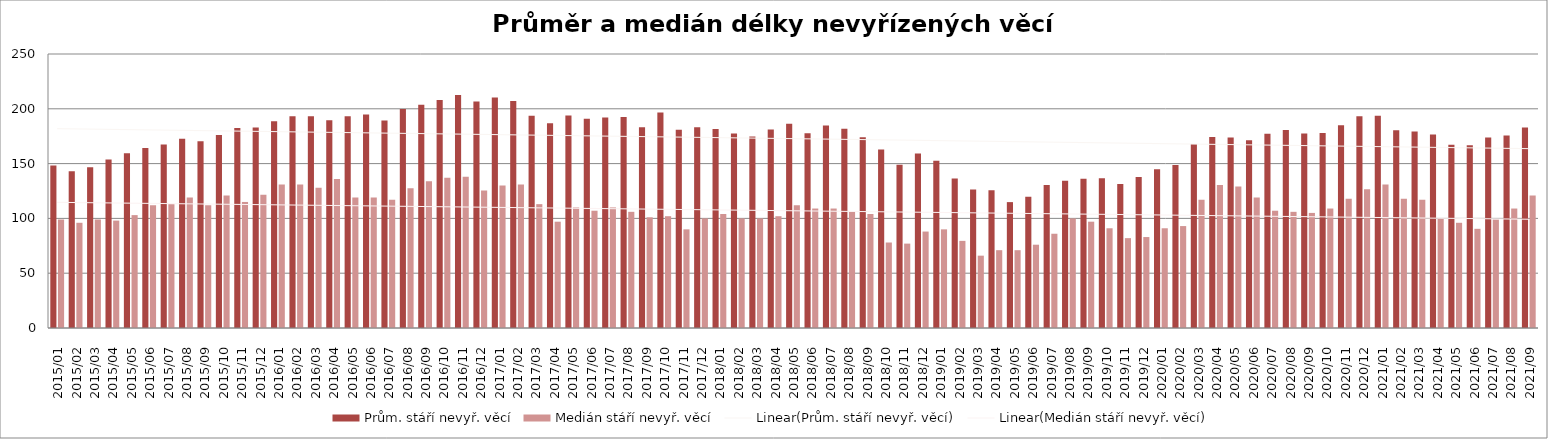
| Category | Prům. stáří nevyř. věcí | Medián stáří nevyř. věcí |
|---|---|---|
| 2015/01 | 148.22 | 99 |
| 2015/02 | 142.92 | 96 |
| 2015/03 | 146.69 | 99 |
| 2015/04 | 153.84 | 98 |
| 2015/05 | 159.42 | 103 |
| 2015/06 | 164.23 | 112 |
| 2015/07 | 167.37 | 113 |
| 2015/08 | 172.63 | 119 |
| 2015/09 | 170.43 | 112 |
| 2015/10 | 176.18 | 121 |
| 2015/11 | 182.49 | 115 |
| 2015/12 | 183 | 121.5 |
| 2016/01 | 188.72 | 131 |
| 2016/02 | 193.22 | 131 |
| 2016/03 | 193.28 | 128 |
| 2016/04 | 189.64 | 136 |
| 2016/05 | 193.29 | 119 |
| 2016/06 | 194.86 | 119 |
| 2016/07 | 189.3 | 117 |
| 2016/08 | 199.83 | 127.5 |
| 2016/09 | 203.68 | 134 |
| 2016/10 | 208.05 | 137 |
| 2016/11 | 212.51 | 138 |
| 2016/12 | 206.73 | 125.5 |
| 2017/01 | 210.23 | 130 |
| 2017/02 | 207.18 | 131 |
| 2017/03 | 193.63 | 113 |
| 2017/04 | 186.71 | 97 |
| 2017/05 | 193.84 | 110 |
| 2017/06 | 190.95 | 107 |
| 2017/07 | 192.12 | 110 |
| 2017/08 | 192.52 | 106 |
| 2017/09 | 183.24 | 101 |
| 2017/10 | 196.68 | 102 |
| 2017/11 | 180.85 | 90 |
| 2017/12 | 183.1 | 100 |
| 2018/01 | 181.46 | 104 |
| 2018/02 | 177.4 | 100 |
| 2018/03 | 174.69 | 100 |
| 2018/04 | 181.07 | 102 |
| 2018/05 | 186.27 | 112 |
| 2018/06 | 177.64 | 109 |
| 2018/07 | 184.83 | 109 |
| 2018/08 | 181.84 | 106 |
| 2018/09 | 174.03 | 104 |
| 2018/10 | 162.88 | 78 |
| 2018/11 | 149.05 | 77 |
| 2018/12 | 159.25 | 88 |
| 2019/01 | 152.58 | 90 |
| 2019/02 | 136.4 | 79.5 |
| 2019/03 | 126.42 | 66 |
| 2019/04 | 125.78 | 71 |
| 2019/05 | 114.87 | 71 |
| 2019/06 | 119.81 | 76 |
| 2019/07 | 130.53 | 86 |
| 2019/08 | 134.39 | 100 |
| 2019/09 | 136.27 | 97 |
| 2019/10 | 136.58 | 91 |
| 2019/11 | 131.4 | 82 |
| 2019/12 | 137.78 | 83 |
| 2020/01 | 144.77 | 91 |
| 2020/02 | 148.65 | 93 |
| 2020/03 | 167.87 | 117 |
| 2020/04 | 174.17 | 130.5 |
| 2020/05 | 173.77 | 129 |
| 2020/06 | 171.38 | 119 |
| 2020/07 | 177.18 | 107 |
| 2020/08 | 180.71 | 106 |
| 2020/09 | 177.53 | 105 |
| 2020/10 | 177.83 | 109 |
| 2020/11 | 184.95 | 118 |
| 2020/12 | 193.2 | 126.5 |
| 2021/01 | 193.74 | 131 |
| 2021/02 | 180.54 | 118 |
| 2021/03 | 179.3 | 117 |
| 2021/04 | 176.48 | 100 |
| 2021/05 | 167.25 | 96 |
| 2021/06 | 166.67 | 90.5 |
| 2021/07 | 173.8 | 99 |
| 2021/08 | 175.65 | 109 |
| 2021/09 | 182.9 | 121 |